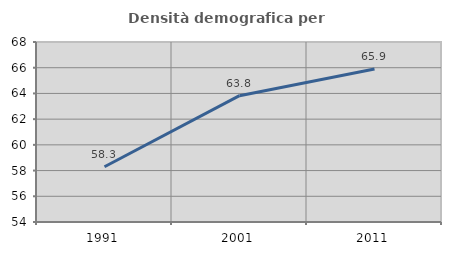
| Category | Densità demografica |
|---|---|
| 1991.0 | 58.296 |
| 2001.0 | 63.826 |
| 2011.0 | 65.899 |